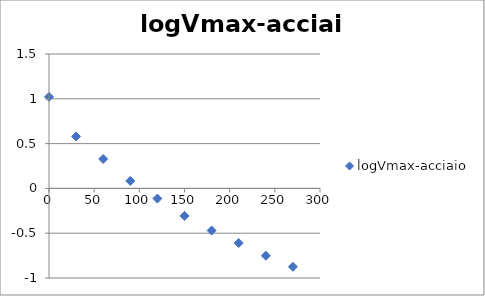
| Category | logVmax-acciaio |
|---|---|
| 0.0 | 1.022 |
| 30.0 | 0.58 |
| 60.0 | 0.329 |
| 90.0 | 0.083 |
| 120.0 | -0.113 |
| 150.0 | -0.307 |
| 180.0 | -0.47 |
| 210.0 | -0.61 |
| 240.0 | -0.751 |
| 270.0 | -0.875 |